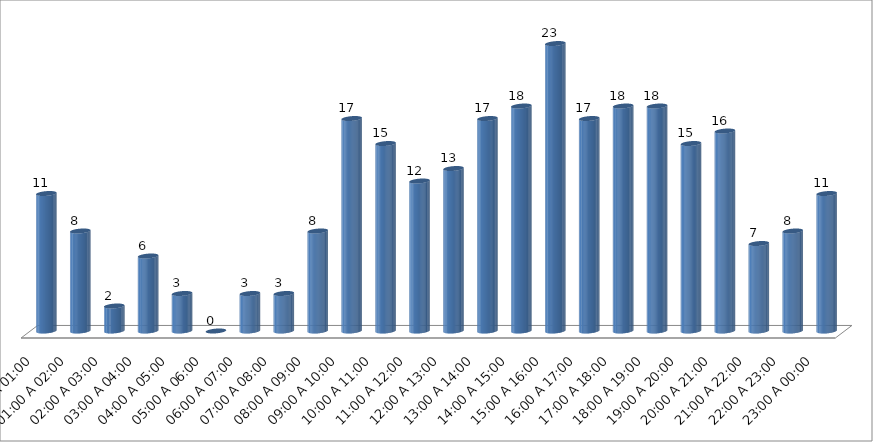
| Category | COMPUTO |
|---|---|
| 00:00 A 01:00 | 11 |
| 01:00 A 02:00 | 8 |
| 02:00 A 03:00 | 2 |
| 03:00 A 04:00 | 6 |
| 04:00 A 05:00 | 3 |
| 05:00 A 06:00 | 0 |
| 06:00 A 07:00 | 3 |
| 07:00 A 08:00 | 3 |
| 08:00 A 09:00 | 8 |
| 09:00 A 10:00 | 17 |
| 10:00 A 11:00 | 15 |
| 11:00 A 12:00 | 12 |
| 12:00 A 13:00 | 13 |
| 13:00 A 14:00 | 17 |
| 14:00 A 15:00 | 18 |
| 15:00 A 16:00 | 23 |
| 16:00 A 17:00 | 17 |
| 17:00 A 18:00 | 18 |
| 18:00 A 19:00 | 18 |
| 19:00 A 20:00 | 15 |
| 20:00 A 21:00 | 16 |
| 21:00 A 22:00 | 7 |
| 22:00 A 23:00 | 8 |
| 23:00 A 00:00 | 11 |